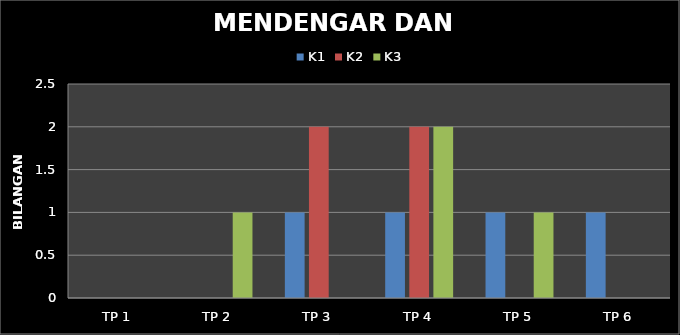
| Category | K1 | K2 | K3 |
|---|---|---|---|
| TP 1 | 0 | 0 | 0 |
| TP 2 | 0 | 0 | 1 |
| TP 3 | 1 | 2 | 0 |
| TP 4 | 1 | 2 | 2 |
| TP 5 | 1 | 0 | 1 |
| TP 6 | 1 | 0 | 0 |